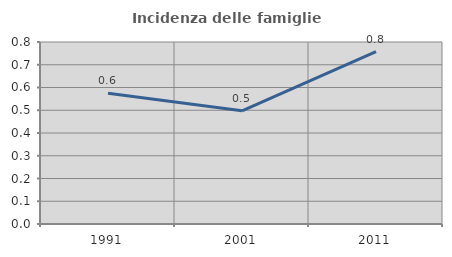
| Category | Incidenza delle famiglie numerose |
|---|---|
| 1991.0 | 0.575 |
| 2001.0 | 0.498 |
| 2011.0 | 0.758 |